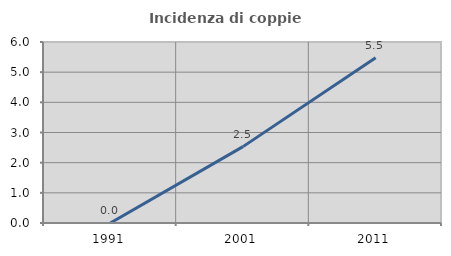
| Category | Incidenza di coppie miste |
|---|---|
| 1991.0 | 0 |
| 2001.0 | 2.532 |
| 2011.0 | 5.479 |